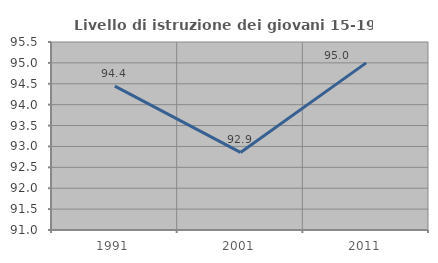
| Category | Livello di istruzione dei giovani 15-19 anni |
|---|---|
| 1991.0 | 94.444 |
| 2001.0 | 92.857 |
| 2011.0 | 95 |